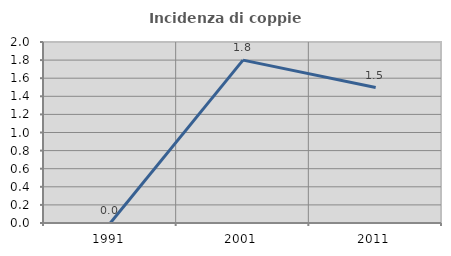
| Category | Incidenza di coppie miste |
|---|---|
| 1991.0 | 0 |
| 2001.0 | 1.799 |
| 2011.0 | 1.497 |